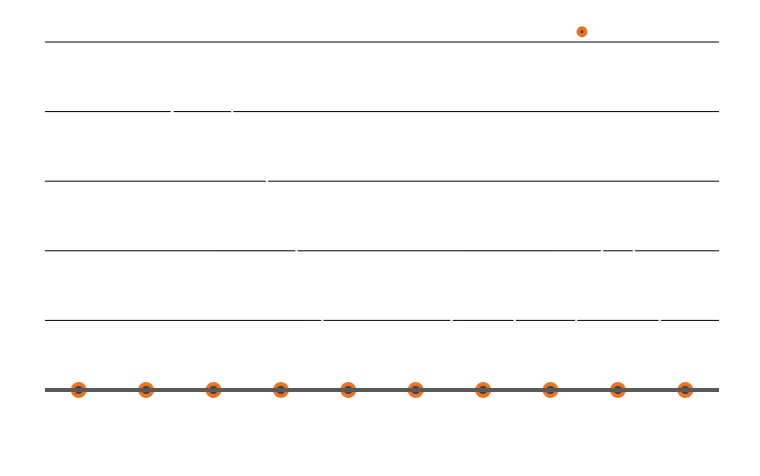
| Category | Ajetut mailit |
|---|---|
| 5/1/12 | 162 |
| 5/2/12 | 183 |
| 5/3/12 | 227 |
| 5/4/12 | 130 |
| 5/5/12 | 0 |
| 5/6/12 | 0 |
| 5/7/12 | 94 |
| 5/8/12 | 0 |
| 5/9/12 | 131 |
| 5/10/12 | 0 |